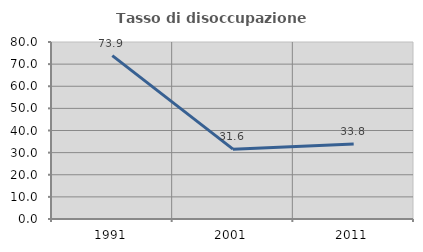
| Category | Tasso di disoccupazione giovanile  |
|---|---|
| 1991.0 | 73.864 |
| 2001.0 | 31.579 |
| 2011.0 | 33.846 |